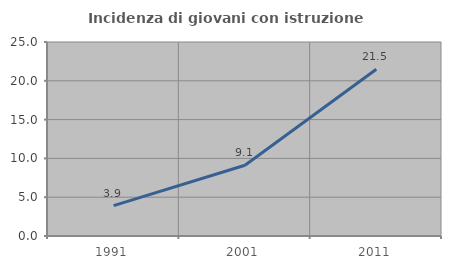
| Category | Incidenza di giovani con istruzione universitaria |
|---|---|
| 1991.0 | 3.922 |
| 2001.0 | 9.12 |
| 2011.0 | 21.486 |